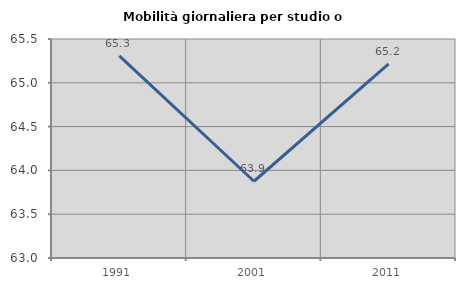
| Category | Mobilità giornaliera per studio o lavoro |
|---|---|
| 1991.0 | 65.307 |
| 2001.0 | 63.876 |
| 2011.0 | 65.217 |